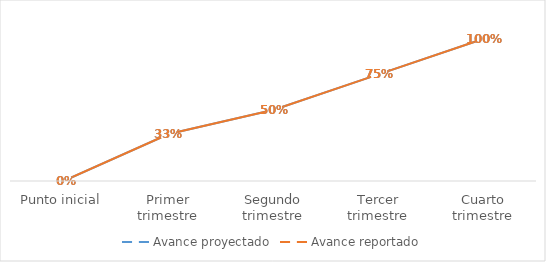
| Category | Avance proyectado | Avance reportado |
|---|---|---|
| Punto inicial | 0 | 0 |
| Primer trimestre | 0.33 | 0.33 |
| Segundo trimestre | 0.5 | 0.5 |
| Tercer trimestre | 0.75 | 0.75 |
| Cuarto trimestre | 1 | 1 |